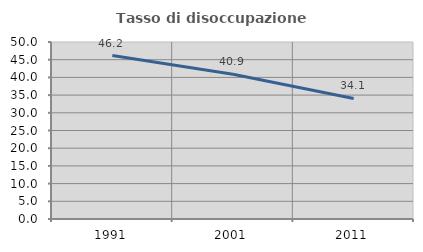
| Category | Tasso di disoccupazione giovanile  |
|---|---|
| 1991.0 | 46.176 |
| 2001.0 | 40.881 |
| 2011.0 | 34.066 |